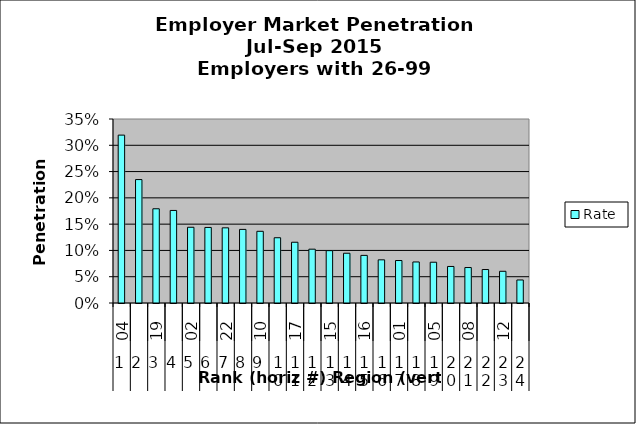
| Category | Rate |
|---|---|
| 0 | 0.319 |
| 1 | 0.235 |
| 2 | 0.179 |
| 3 | 0.176 |
| 4 | 0.144 |
| 5 | 0.144 |
| 6 | 0.143 |
| 7 | 0.14 |
| 8 | 0.136 |
| 9 | 0.124 |
| 10 | 0.116 |
| 11 | 0.102 |
| 12 | 0.1 |
| 13 | 0.095 |
| 14 | 0.091 |
| 15 | 0.082 |
| 16 | 0.081 |
| 17 | 0.078 |
| 18 | 0.078 |
| 19 | 0.07 |
| 20 | 0.067 |
| 21 | 0.064 |
| 22 | 0.06 |
| 23 | 0.044 |